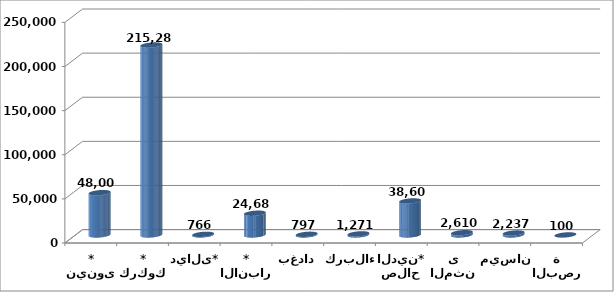
| Category | إجمالي المساحة  Total Area  |
|---|---|
| نينوى* | 48002 |
| كركوك* | 215286 |
| ديالى* | 766 |
| الانبار* | 24683.1 |
| بغداد | 797 |
| كربلاء  | 1271 |
| صلاح الدين* | 38606 |
| المثنى | 2610 |
| ميسان | 2237 |
| البصرة | 100 |